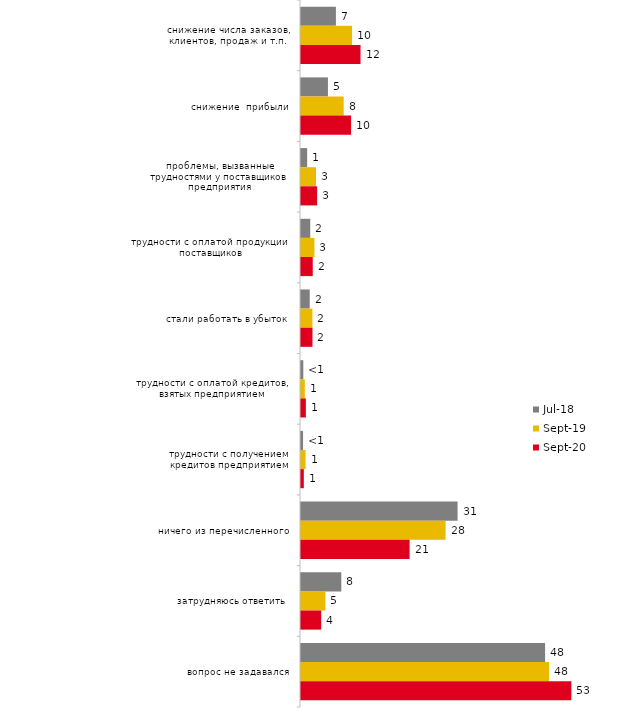
| Category | июл.18 | сен.19 | сен.20 |
|---|---|---|---|
| снижение числа заказов, клиентов, продаж и т.п. | 6.8 | 9.95 | 11.598 |
| снижение  прибыли | 5.25 | 8.317 | 9.756 |
| проблемы, вызванные трудностями у поставщиков предприятия | 1.2 | 2.921 | 3.136 |
| трудности с оплатой продукции поставщиков | 1.8 | 2.624 | 2.29 |
| стали работать в убыток | 1.7 | 2.228 | 2.24 |
| трудности с оплатой кредитов, взятых предприятием | 0.45 | 0.743 | 0.946 |
| трудности с получением кредитов предприятием | 0.4 | 0.891 | 0.548 |
| ничего из перечисленного | 30.5 | 28.168 | 21.155 |
| затрудняюсь ответить | 7.85 | 4.752 | 3.932 |
| вопрос не задавался | 47.55 | 48.317 | 52.663 |